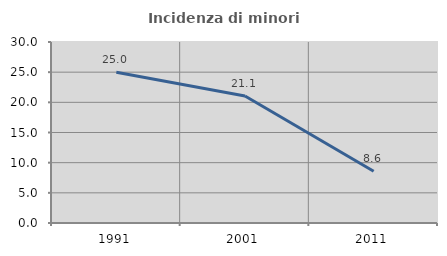
| Category | Incidenza di minori stranieri |
|---|---|
| 1991.0 | 25 |
| 2001.0 | 21.053 |
| 2011.0 | 8.571 |